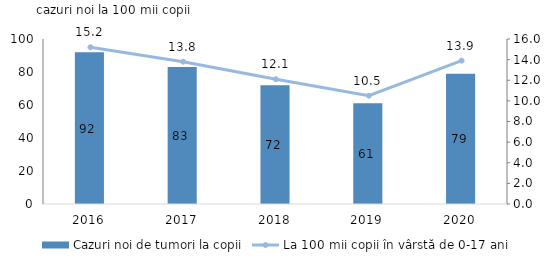
| Category | Cazuri noi de tumori la copii |
|---|---|
| 2016.0 | 92 |
| 2017.0 | 83 |
| 2018.0 | 72 |
| 2019.0 | 61 |
| 2020.0 | 79 |